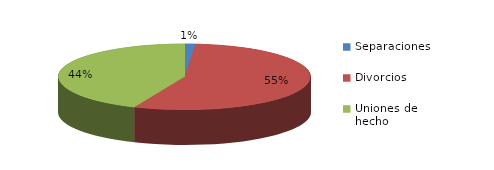
| Category | Series 0 |
|---|---|
| Separaciones | 7 |
| Divorcios | 277 |
| Uniones de hecho | 219 |